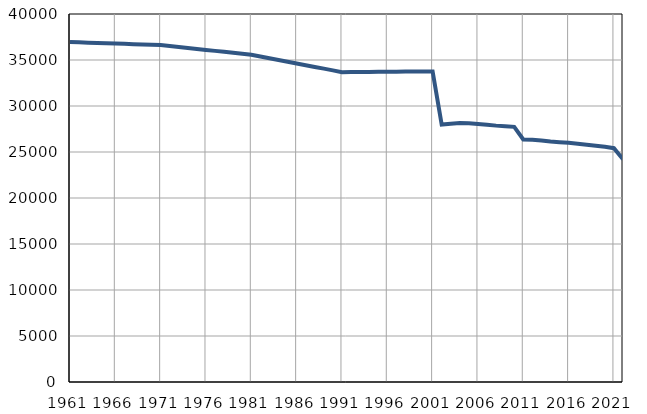
| Category | Број
становника |
|---|---|
| 1961.0 | 36950 |
| 1962.0 | 36917 |
| 1963.0 | 36884 |
| 1964.0 | 36852 |
| 1965.0 | 36819 |
| 1966.0 | 36786 |
| 1967.0 | 36753 |
| 1968.0 | 36720 |
| 1969.0 | 36688 |
| 1970.0 | 36655 |
| 1971.0 | 36622 |
| 1972.0 | 36517 |
| 1973.0 | 36411 |
| 1974.0 | 36306 |
| 1975.0 | 36201 |
| 1976.0 | 36096 |
| 1977.0 | 35991 |
| 1978.0 | 35886 |
| 1979.0 | 35780 |
| 1980.0 | 35675 |
| 1981.0 | 35570 |
| 1982.0 | 35381 |
| 1983.0 | 35192 |
| 1984.0 | 35003 |
| 1985.0 | 34814 |
| 1986.0 | 34626 |
| 1987.0 | 34437 |
| 1988.0 | 34248 |
| 1989.0 | 34060 |
| 1990.0 | 33870 |
| 1991.0 | 33681 |
| 1992.0 | 33689 |
| 1993.0 | 33697 |
| 1994.0 | 33705 |
| 1995.0 | 33713 |
| 1996.0 | 33721 |
| 1997.0 | 33729 |
| 1998.0 | 33737 |
| 1999.0 | 33746 |
| 2000.0 | 33753 |
| 2001.0 | 33761 |
| 2002.0 | 27988 |
| 2003.0 | 28083 |
| 2004.0 | 28155 |
| 2005.0 | 28120 |
| 2006.0 | 28048 |
| 2007.0 | 27959 |
| 2008.0 | 27867 |
| 2009.0 | 27809 |
| 2010.0 | 27735 |
| 2011.0 | 26366 |
| 2012.0 | 26329 |
| 2013.0 | 26259 |
| 2014.0 | 26141 |
| 2015.0 | 26067 |
| 2016.0 | 25993 |
| 2017.0 | 25907 |
| 2018.0 | 25798 |
| 2019.0 | 25690 |
| 2020.0 | 25560 |
| 2021.0 | 25411 |
| 2022.0 | 24204 |